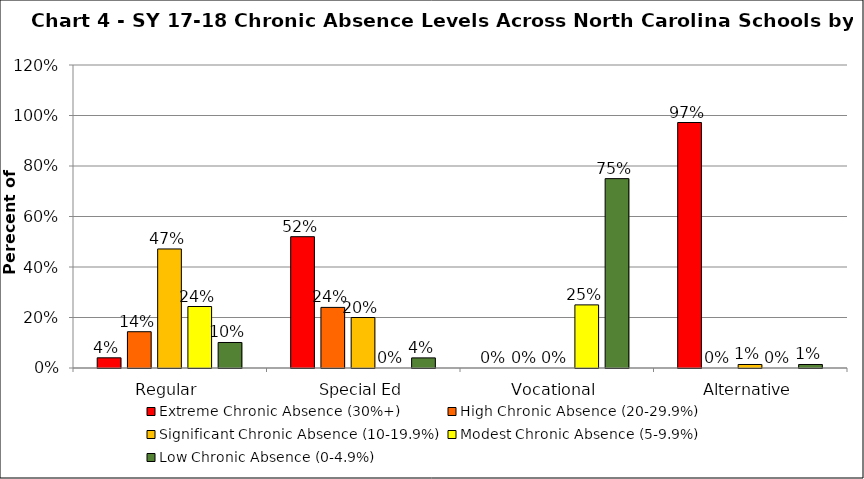
| Category | Extreme Chronic Absence (30%+) | High Chronic Absence (20-29.9%) | Significant Chronic Absence (10-19.9%) | Modest Chronic Absence (5-9.9%) | Low Chronic Absence (0-4.9%) |
|---|---|---|---|---|---|
| 0 | 0.04 | 0.144 | 0.471 | 0.244 | 0.101 |
| 1 | 0.52 | 0.24 | 0.2 | 0 | 0.04 |
| 2 | 0 | 0 | 0 | 0.25 | 0.75 |
| 3 | 0.972 | 0 | 0.014 | 0 | 0.014 |